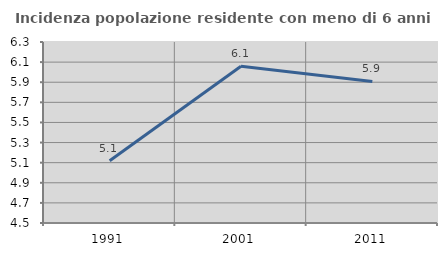
| Category | Incidenza popolazione residente con meno di 6 anni |
|---|---|
| 1991.0 | 5.118 |
| 2001.0 | 6.058 |
| 2011.0 | 5.907 |